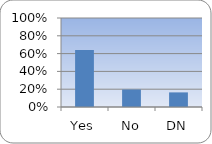
| Category | Series 0 |
|---|---|
| Yes | 0.639 |
| No | 0.197 |
| DN | 0.164 |